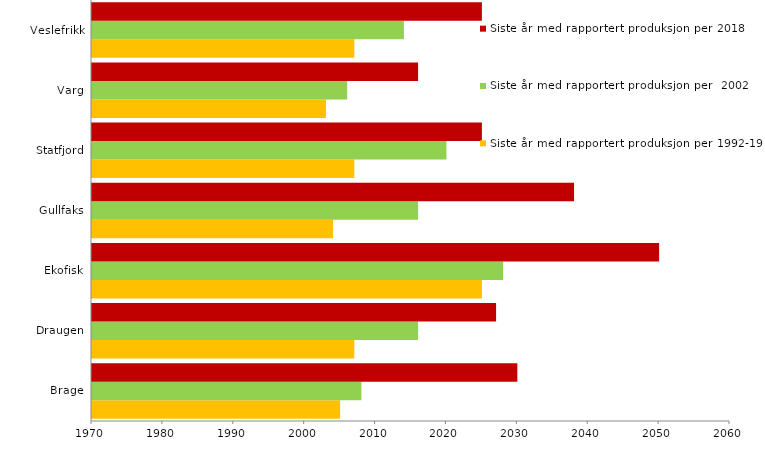
| Category | Siste år med rapportert produksjon per 1992-1995 | Siste år med rapportert produksjon per  2002 | Siste år med rapportert produksjon per 2018 |
|---|---|---|---|
| Brage | 2005 | 2008 | 2030 |
| Draugen | 2007 | 2016 | 2027 |
| Ekofisk | 2025 | 2028 | 2050 |
| Gullfaks | 2004 | 2016 | 2038 |
| Statfjord | 2007 | 2020 | 2025 |
| Varg | 2003 | 2006 | 2016 |
| Veslefrikk | 2007 | 2014 | 2025 |